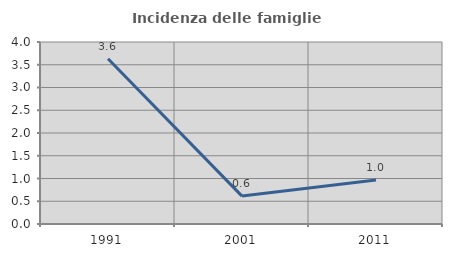
| Category | Incidenza delle famiglie numerose |
|---|---|
| 1991.0 | 3.63 |
| 2001.0 | 0.613 |
| 2011.0 | 0.965 |